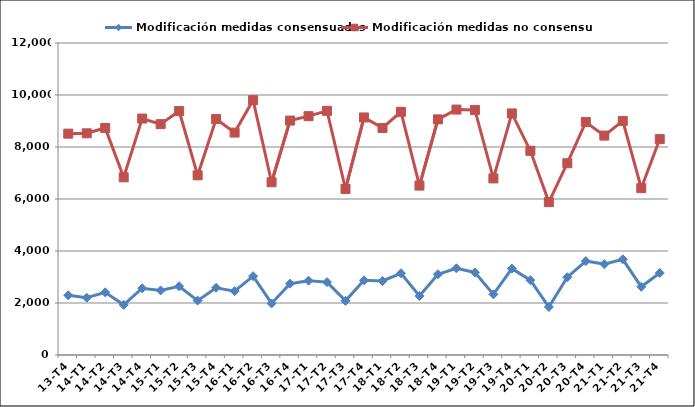
| Category | Modificación medidas consensuadas | Modificación medidas no consensuadas |
|---|---|---|
| 13-T4 | 2298 | 8514 |
| 14-T1 | 2203 | 8527 |
| 14-T2 | 2411 | 8733 |
| 14-T3 | 1929 | 6834 |
| 14-T4 | 2567 | 9094 |
| 15-T1 | 2483 | 8879 |
| 15-T2 | 2644 | 9382 |
| 15-T3 | 2092 | 6911 |
| 15-T4 | 2586 | 9076 |
| 16-T1 | 2455 | 8554 |
| 16-T2 | 3032 | 9802 |
| 16-T3 | 1983 | 6644 |
| 16-T4 | 2744 | 9017 |
| 17-T1 | 2859 | 9186 |
| 17-T2 | 2804 | 9391 |
| 17-T3 | 2082 | 6385 |
| 17-T4 | 2872 | 9137 |
| 18-T1 | 2846 | 8734 |
| 18-T2 | 3144 | 9353 |
| 18-T3 | 2272 | 6516 |
| 18-T4 | 3104 | 9063 |
| 19-T1 | 3335 | 9440 |
| 19-T2 | 3176 | 9426 |
| 19-T3 | 2332 | 6792 |
| 19-T4 | 3323 | 9291 |
| 20-T1 | 2880 | 7854 |
| 20-T2 | 1846 | 5880 |
| 20-T3 | 2991 | 7376 |
| 20-T4 | 3612 | 8960 |
| 21-T1 | 3496 | 8439 |
| 21-T2 | 3680 | 9003 |
| 21-T3 | 2625 | 6416 |
| 21-T4 | 3154 | 8304 |